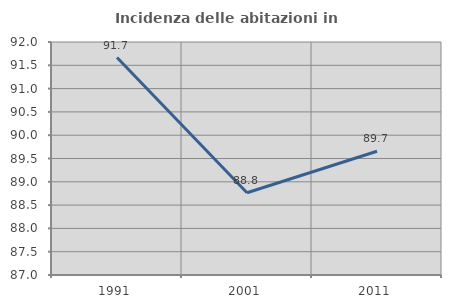
| Category | Incidenza delle abitazioni in proprietà  |
|---|---|
| 1991.0 | 91.667 |
| 2001.0 | 88.764 |
| 2011.0 | 89.655 |